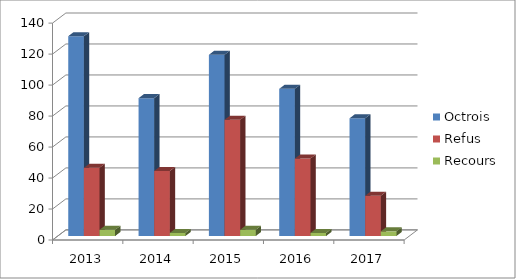
| Category | Octrois | Refus | Recours |
|---|---|---|---|
| 2013.0 | 129 | 44 | 4 |
| 2014.0 | 89 | 42 | 2 |
| 2015.0 | 117 | 75 | 4 |
| 2016.0 | 95 | 50 | 2 |
| 2017.0 | 76 | 26 | 3 |